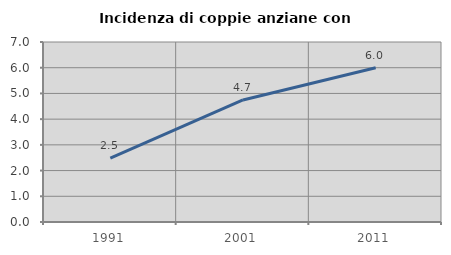
| Category | Incidenza di coppie anziane con figli |
|---|---|
| 1991.0 | 2.479 |
| 2001.0 | 4.747 |
| 2011.0 | 6 |